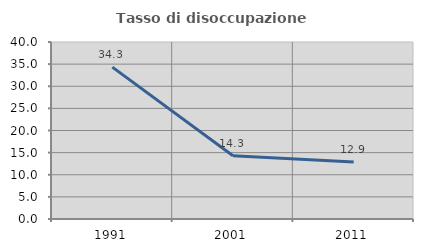
| Category | Tasso di disoccupazione giovanile  |
|---|---|
| 1991.0 | 34.314 |
| 2001.0 | 14.286 |
| 2011.0 | 12.857 |